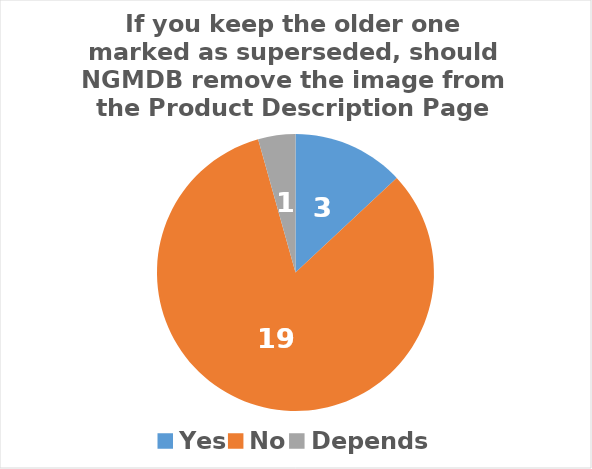
| Category | Series 0 |
|---|---|
| Yes | 3 |
| No | 19 |
| Depends | 1 |